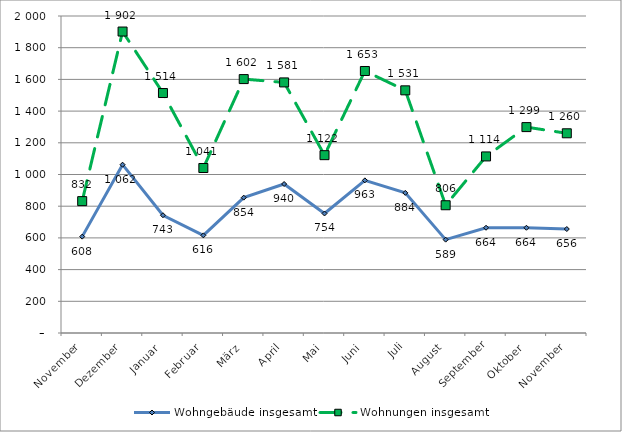
| Category | Wohngebäude insgesamt | Wohnungen insgesamt |
|---|---|---|
| November | 608 | 832 |
| Dezember | 1062 | 1902 |
| Januar | 743 | 1514 |
| Februar | 616 | 1041 |
| März | 854 | 1602 |
| April | 940 | 1581 |
| Mai | 754 | 1122 |
| Juni | 963 | 1653 |
| Juli | 884 | 1531 |
| August | 589 | 806 |
| September | 664 | 1114 |
| Oktober | 664 | 1299 |
| November | 656 | 1260 |